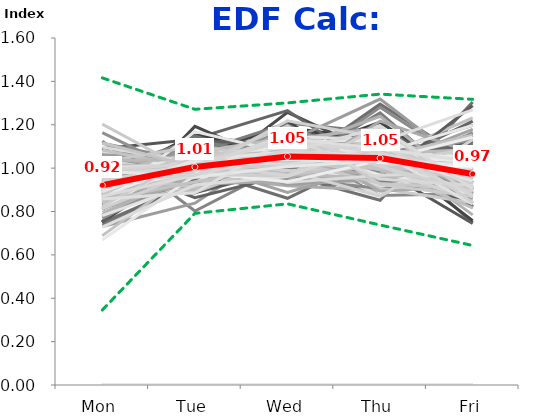
| Category | 1/1/01 | 1/8/01 | 1/15/01 | 1/22/01 | 1/29/01 | 2/5/01 | 2/12/01 | 2/19/01 | 2/26/01 | 3/5/01 | 3/12/01 | 3/19/01 | 3/26/01 | 4/2/01 | 4/9/01 | 4/16/01 | 4/23/01 | 4/30/01 | 5/7/01 | 5/14/01 | 5/21/01 | 5/28/01 | 6/4/01 | 6/11/01 | 6/18/01 | 6/25/01 | 7/2/01 | 7/9/01 | 7/16/01 | 7/23/01 | 7/30/01 | 8/6/01 | 8/13/01 | 8/20/01 | 8/27/01 | 9/3/01 | 9/10/01 | 9/17/01 | 9/24/01 | 10/1/01 | 10/8/01 | 10/15/01 | 10/22/01 | 10/29/01 | 11/5/01 | 11/12/01 | 11/19/01 | 11/26/01 | 12/3/01 | 12/10/01 | 12/17/01 | 12/24/01 | 12/31/01 | 1/7/02 | 1/14/02 | 1/21/02 | 1/28/02 | 2/4/02 | 2/11/02 | 2/18/02 | 2/25/02 | 3/4/02 | 3/11/02 | 3/18/02 | 3/25/02 | 4/1/02 | 4/8/02 | 4/15/02 | 4/22/02 | 4/29/02 | 5/6/02 | 5/13/02 | 5/20/02 | 5/27/02 | 6/3/02 | 6/10/02 | 6/17/02 | 6/24/02 | 7/1/02 | 7/8/02 | 7/15/02 | 7/22/02 | 7/29/02 | 8/5/02 | 8/12/02 | 8/19/02 | 8/26/02 | 9/2/02 | 9/9/02 | 9/16/02 | 9/23/02 | 9/30/02 | 10/7/02 | 10/14/02 | 10/21/02 | 10/28/02 | 11/4/02 | 11/11/02 | 11/18/02 | 11/25/02 | 12/2/02 | 12/9/02 | 12/16/02 | 12/23/02 | 12/30/02 | 1/6/03 | 1/13/03 | 1/20/03 | 1/27/03 | 2/3/03 | 2/10/03 | 2/17/03 | 2/24/03 | 3/3/03 | 3/10/03 | 3/17/03 | 3/24/03 | 3/31/03 | 4/7/03 | 4/14/03 | 4/21/03 | 4/28/03 | 5/5/03 | 5/12/03 | 5/19/03 | 5/26/03 | 6/2/03 | 6/9/03 | 6/16/03 | 6/23/03 | 6/30/03 | 7/7/03 | 7/14/03 | 7/21/03 | 7/28/03 | 8/4/03 | 8/11/03 | 8/18/03 | 8/25/03 | 9/1/03 | 9/8/03 | 9/15/03 | 9/22/03 | 9/29/03 | 10/6/03 | 10/13/03 | 10/20/03 | 10/27/03 | 11/3/03 | 11/10/03 | 11/17/03 | 11/24/03 | 12/1/03 | 12/8/03 | 12/15/03 | 12/22/03 | 12/29/03 | 1/5/04 | 1/12/04 | 1/19/04 | 1/26/04 | 2/2/04 | 2/9/04 | 2/16/04 | 2/23/04 | 3/1/04 | 3/8/04 | 3/15/04 | 3/22/04 | 3/29/04 | 4/5/04 | 4/12/04 | 4/19/04 | 4/26/04 | 5/3/04 | 5/10/04 | 5/17/04 | 5/24/04 | 5/31/04 | 6/7/04 | 6/14/04 | 6/21/04 | 6/28/04 | 7/5/04 | 7/12/04 | 7/19/04 | 7/26/04 | 8/2/04 | 8/9/04 | 8/16/04 | 8/23/04 | 8/30/04 | 9/6/04 | 9/13/04 | 9/20/04 | 9/27/04 | 10/4/04 | 10/11/04 | 10/18/04 | 10/25/04 | 11/1/04 | 11/8/04 | 11/15/04 | 11/22/04 | 11/29/04 | 12/6/04 | 12/13/04 | 12/20/04 | 12/27/04 | 1/3/05 | 1/10/05 | 1/17/05 | 1/24/05 | 1/31/05 | 2/7/05 | 2/14/05 | 2/21/05 | 2/28/05 | 3/7/05 | 3/14/05 | 3/21/05 | 3/28/05 | 4/4/05 | 4/11/05 | 4/18/05 | 4/25/05 | 5/2/05 | 5/9/05 | 5/16/05 | 5/23/05 | 5/30/05 | 6/6/05 | 6/13/05 | 6/20/05 | 6/27/05 | 7/4/05 | 7/11/05 | 7/18/05 | 7/25/05 | 8/1/05 | 8/8/05 | 8/15/05 | 8/22/05 | 8/29/05 | 9/5/05 | 9/12/05 | 9/19/05 | 9/26/05 | 10/3/05 | 10/10/05 | 10/17/05 | Min: | Max: | FINAL: |
|---|---|---|---|---|---|---|---|---|---|---|---|---|---|---|---|---|---|---|---|---|---|---|---|---|---|---|---|---|---|---|---|---|---|---|---|---|---|---|---|---|---|---|---|---|---|---|---|---|---|---|---|---|---|---|---|---|---|---|---|---|---|---|---|---|---|---|---|---|---|---|---|---|---|---|---|---|---|---|---|---|---|---|---|---|---|---|---|---|---|---|---|---|---|---|---|---|---|---|---|---|---|---|---|---|---|---|---|---|---|---|---|---|---|---|---|---|---|---|---|---|---|---|---|---|---|---|---|---|---|---|---|---|---|---|---|---|---|---|---|---|---|---|---|---|---|---|---|---|---|---|---|---|---|---|---|---|---|---|---|---|---|---|---|---|---|---|---|---|---|---|---|---|---|---|---|---|---|---|---|---|---|---|---|---|---|---|---|---|---|---|---|---|---|---|---|---|---|---|---|---|---|---|---|---|---|---|---|---|---|---|---|---|---|---|---|---|---|---|---|---|---|---|---|---|---|---|---|---|---|---|---|---|---|---|---|---|---|---|---|---|---|---|---|---|---|---|---|---|---|---|---|---|---|---|
| Mon | 0 | 0.882 | 0 | 0.96 | 0.928 | 0.934 | 0.915 | 0 | 0.933 | 0.866 | 0.901 | 0.827 | 0.888 | 0.924 | 0 | 0 | 0.873 | 1.055 | 0.94 | 0.737 | 1.089 | 0 | 0.88 | 0 | 0.871 | 0 | 0 | 0.842 | 0.85 | 0.864 | 0.81 | 0.82 | 0.858 | 0.884 | 0.864 | 0 | 0 | 1.125 | 1.064 | 0.847 | 0.749 | 0.824 | 0.868 | 0.893 | 0.949 | 0.754 | 0 | 0.849 | 0.857 | 0.882 | 0.857 | 0 | 0 | 1 | 0.941 | 0 | 0.748 | 0.939 | 0.946 | 0 | 0.984 | 1.051 | 0.909 | 0.931 | 0 | 0.894 | 0.836 | 0.877 | 0.859 | 0.933 | 0.885 | 0.844 | 0.912 | 0 | 0.877 | 0.83 | 0 | 0 | 0 | 0.731 | 0.964 | 0.953 | 1.005 | 0.965 | 0.779 | 1.007 | 0.893 | 0 | 0 | 0.689 | 0.871 | 1.047 | 0.852 | 0.751 | 0.952 | 0.934 | 1.091 | 0.817 | 0 | 0 | 1.115 | 1.016 | 0.875 | 0 | 0 | 0.948 | 0.987 | 0 | 0.955 | 0.913 | 0.926 | 0 | 0.913 | 0.929 | 0.816 | 1.053 | 1.014 | 1.049 | 1.164 | 0 | 0.753 | 0.852 | 0.989 | 0.958 | 0.974 | 0 | 1.028 | 0.95 | 0.885 | 1.001 | 0 | 0.979 | 0.927 | 0.896 | 0.905 | 0.993 | 0 | 0.887 | 0.897 | 0 | 0.965 | 0.832 | 0.885 | 0.924 | 0.815 | 0.796 | 0.77 | 0.879 | 0.975 | 0.961 | 1.031 | 0 | 0.974 | 0.898 | 0.979 | 0 | 0 | 0.929 | 0.933 | 0 | 0.857 | 1.024 | 0.903 | 0 | 0.968 | 1.07 | 0.814 | 1.074 | 0.996 | 0.937 | 0 | 0.781 | 0.785 | 0.781 | 1.062 | 1.203 | 1.051 | 0.892 | 0 | 0 | 0.901 | 0 | 0.989 | 0 | 0.844 | 0.887 | 0.958 | 0.921 | 0.866 | 0.959 | 0.975 | 0.841 | 0 | 1.038 | 0.913 | 0.847 | 1.083 | 0.668 | 0.876 | 0.861 | 0.865 | 0.934 | 0.97 | 0 | 0.855 | 0.902 | 0 | 0 | 1.027 | 0.958 | 1.012 | 0 | 0.931 | 1.035 | 0.913 | 0.869 | 0 | 1.097 | 0.952 | 0 | 0 | 0.815 | 1.116 | 0.728 | 0.987 | 0.849 | 0.981 | 0.906 | 0.993 | 1.002 | 0 | 0.876 | 0 | 0 | 1.001 | 0 | 0.993 | 0.825 | 0.899 | 0.901 | 0.953 | 0.892 | 0.972 | 0.814 | 0 | 0 | 0.907 | 0.987 | 0.87 | 0.94 | 0.858 | 0.346 | 1.416 | 0.921 |
| Tue | 0 | 0.971 | 0 | 1.016 | 1.016 | 0.976 | 0.947 | 0 | 0.919 | 1.022 | 0.998 | 0.908 | 1.059 | 1.021 | 0 | 0 | 1.031 | 0.984 | 0.996 | 0.921 | 1.133 | 0 | 1.152 | 0 | 0.928 | 0 | 0 | 1.018 | 1.012 | 1.051 | 1.063 | 1.01 | 0.978 | 1.022 | 1.009 | 0 | 0 | 0.802 | 0.995 | 0.905 | 0.933 | 0.969 | 1.037 | 1.048 | 1.018 | 1.028 | 0 | 0.973 | 0.931 | 0.991 | 0.913 | 0 | 0 | 0.964 | 1.012 | 0 | 1.135 | 1.155 | 0.921 | 0 | 0.953 | 1.017 | 1.005 | 0.991 | 0 | 1.009 | 0.943 | 1.051 | 1.016 | 1.156 | 1.07 | 1.095 | 1.11 | 0 | 0.995 | 0.955 | 0 | 0 | 0 | 0.838 | 0.91 | 1.026 | 1.044 | 1.026 | 0.978 | 1.023 | 1.149 | 0 | 0 | 0.996 | 1.073 | 1.002 | 1.046 | 1.193 | 1.009 | 1.032 | 0.886 | 0.993 | 0 | 0 | 1.03 | 0.989 | 0.887 | 0 | 0 | 1.05 | 0.972 | 0 | 0.969 | 1.053 | 0.979 | 0 | 1.102 | 0.972 | 0.934 | 0.963 | 1.042 | 1.024 | 0.955 | 0 | 1.124 | 1.013 | 1.131 | 0.989 | 1.076 | 0 | 0.864 | 0.928 | 0.971 | 1.024 | 0 | 1.072 | 1.034 | 1.026 | 1.023 | 1.02 | 0 | 1.013 | 1.128 | 0 | 1.026 | 1.014 | 0.926 | 1.075 | 1.042 | 0.961 | 0.973 | 1.116 | 1.002 | 0.898 | 1.016 | 0 | 1.019 | 1.074 | 0.996 | 0 | 0 | 0.899 | 0.982 | 0 | 0.965 | 0.968 | 0.97 | 0 | 1.062 | 1.067 | 0.956 | 1.011 | 1.001 | 0.889 | 0 | 0.997 | 0.991 | 0.934 | 1.04 | 0.972 | 0.993 | 1.12 | 0 | 0 | 1.021 | 0 | 1.032 | 0 | 0.904 | 0.968 | 1.079 | 0.983 | 0.997 | 1.022 | 1.073 | 1.168 | 0 | 0.972 | 0.999 | 0.925 | 0.999 | 0.967 | 1.082 | 1.061 | 0.987 | 1.016 | 0.913 | 0 | 0.986 | 1.015 | 0 | 0 | 1.102 | 1.063 | 1.012 | 0 | 1.013 | 1.039 | 0.961 | 1.038 | 0 | 1.025 | 0.981 | 0 | 0 | 1.061 | 1.005 | 0.922 | 0.994 | 0.938 | 1.035 | 0.979 | 1.017 | 1.018 | 0 | 1.089 | 0 | 0 | 0.969 | 0 | 1.019 | 1.056 | 1.031 | 1.028 | 0.987 | 1.037 | 1.003 | 0.987 | 0 | 0 | 1.019 | 0.957 | 0.968 | 0.968 | 0.887 | 0.791 | 1.271 | 1.006 |
| Wed | 0 | 1.025 | 0 | 1.079 | 1.143 | 1.071 | 1.014 | 0 | 1.011 | 1.055 | 1.025 | 0.982 | 1.027 | 1.114 | 0 | 0 | 1.022 | 1.118 | 1.119 | 1.208 | 1.037 | 0 | 1.095 | 0 | 1.058 | 0 | 0 | 1.115 | 1.076 | 1.122 | 1.195 | 1.113 | 1.088 | 1.09 | 0.985 | 0 | 0 | 1.021 | 0.948 | 1.187 | 0.998 | 1.168 | 1.047 | 1.092 | 1.071 | 1.092 | 0 | 1.062 | 1.257 | 1.052 | 1.008 | 0 | 0 | 1.114 | 1.072 | 0 | 1.265 | 1.081 | 0.992 | 0 | 1.013 | 1.011 | 1.057 | 1.031 | 0 | 1.046 | 1.104 | 1.078 | 1.006 | 1.03 | 1.207 | 1.103 | 1.058 | 0 | 0.861 | 1.215 | 0 | 0 | 0 | 1.121 | 0.969 | 1.181 | 1.148 | 1.013 | 1.157 | 1.059 | 1.016 | 0 | 0 | 1.033 | 1.064 | 0.967 | 0.992 | 1.006 | 1.05 | 0.959 | 1.095 | 1.055 | 0 | 0 | 1.099 | 0.998 | 0.996 | 0 | 0 | 0.974 | 1.005 | 0 | 1.051 | 1.062 | 0.94 | 0 | 1.018 | 1.035 | 1.061 | 0.919 | 1.03 | 1.114 | 1.008 | 0 | 1.115 | 1.176 | 1.041 | 0.968 | 1.032 | 0 | 0.97 | 1.089 | 0.979 | 1.053 | 0 | 1.108 | 1.088 | 0.971 | 0.948 | 1.124 | 0 | 0.96 | 0.983 | 0 | 1.138 | 0.974 | 1.102 | 1.066 | 1.003 | 1.15 | 1.078 | 1 | 0.986 | 1.034 | 1.003 | 0 | 1.022 | 1.066 | 0.933 | 0 | 0 | 1.022 | 0.953 | 0 | 1.081 | 1.048 | 1.199 | 0 | 0.941 | 0.953 | 1.083 | 1.024 | 1.048 | 1.042 | 0 | 1.081 | 1.131 | 1.144 | 0.925 | 1.079 | 1.143 | 1.008 | 0 | 0 | 0.888 | 0 | 1.102 | 0 | 1.1 | 1.124 | 1.039 | 0.986 | 1.103 | 1.028 | 1.14 | 1.067 | 0 | 0.99 | 1.102 | 0.94 | 1.013 | 1.1 | 1.062 | 1.092 | 1.048 | 1.031 | 1.119 | 0 | 1.091 | 1.034 | 0 | 0 | 1.039 | 1.095 | 1.079 | 0 | 1.023 | 0.971 | 1.039 | 1.009 | 0 | 0.933 | 1.086 | 0 | 0 | 1.014 | 0.972 | 0.962 | 1.014 | 1.01 | 1.129 | 0.937 | 1.195 | 1.074 | 0 | 1.018 | 0 | 0 | 0.966 | 0 | 0.966 | 1.069 | 1.018 | 1.041 | 1.16 | 1.075 | 1.155 | 1.218 | 0 | 0 | 1.126 | 1.008 | 1.068 | 1.084 | 1.136 | 0.835 | 1.301 | 1.054 |
| Thu | 0 | 1.115 | 0 | 1.038 | 0.987 | 1.024 | 1.017 | 0 | 1.069 | 1.046 | 0.924 | 1.281 | 0.985 | 1.008 | 0 | 0 | 1.141 | 0.947 | 1.047 | 1.165 | 0.997 | 0 | 1.124 | 0 | 1.212 | 0 | 0 | 1.123 | 1.104 | 1.066 | 1.094 | 1.104 | 1.081 | 0.969 | 1.183 | 0 | 0 | 0.952 | 0.904 | 1.129 | 1.296 | 1.011 | 1.071 | 1.063 | 1.139 | 1.1 | 0 | 1.034 | 1.058 | 1.096 | 1.005 | 0 | 0 | 0.994 | 1.007 | 0 | 0.983 | 0.935 | 1.031 | 0 | 1.001 | 0.995 | 0.908 | 1.058 | 0 | 1.101 | 1.147 | 1.066 | 1.112 | 0.968 | 0.911 | 0.972 | 1.102 | 0 | 1.069 | 0.951 | 0 | 0 | 0 | 1.319 | 0.852 | 1.083 | 0.942 | 1.118 | 1.133 | 1.074 | 1.117 | 0 | 0 | 1.049 | 1.041 | 0.95 | 1.118 | 1.15 | 1.107 | 1.096 | 0.972 | 1.096 | 0 | 0 | 0.874 | 0.972 | 0.954 | 0 | 0 | 1.039 | 1.076 | 0 | 0.994 | 1.047 | 1.112 | 0 | 0.955 | 1.004 | 1.153 | 0.897 | 0.957 | 0.944 | 0.991 | 0 | 1.102 | 0.929 | 0.938 | 1.042 | 1.055 | 0 | 1.015 | 1.118 | 1.005 | 1.001 | 0 | 1.004 | 1.071 | 1.118 | 1.176 | 1.044 | 0 | 1.122 | 1.08 | 0 | 0.971 | 1.083 | 1.068 | 0.874 | 1.254 | 1.071 | 1.047 | 1.045 | 1.023 | 1.068 | 0.995 | 0 | 1.088 | 1.065 | 1.024 | 0 | 0 | 1.145 | 1.057 | 0 | 1.131 | 1.014 | 1.015 | 0 | 0.962 | 0.906 | 1.239 | 0.917 | 1.048 | 1.042 | 0 | 1.101 | 1.187 | 1.133 | 0.949 | 0.906 | 0.893 | 1.058 | 0 | 0 | 1.011 | 0 | 1.094 | 0 | 1.067 | 1.127 | 1.028 | 1.017 | 1.109 | 1.019 | 0.995 | 1.057 | 0 | 0.87 | 1.021 | 1.217 | 1.01 | 1.069 | 1.069 | 1.018 | 1.069 | 0.959 | 0.994 | 0 | 1.098 | 1.076 | 0 | 0 | 0.929 | 0.969 | 0.991 | 0 | 0.999 | 0.954 | 1.034 | 1.053 | 0 | 0.968 | 1.054 | 0 | 0 | 1.052 | 1.007 | 1.12 | 1.053 | 1.05 | 1.012 | 1.036 | 0.925 | 1.071 | 0 | 1.077 | 0 | 0 | 1.194 | 0 | 1.103 | 1.12 | 1.067 | 1.027 | 1.008 | 1.055 | 0.95 | 1.14 | 0 | 0 | 1.072 | 1.034 | 1.19 | 1.041 | 1.089 | 0.738 | 1.341 | 1.046 |
| Fri | 0 | 1.008 | 0 | 0.907 | 0.925 | 0.994 | 1.108 | 0 | 1.068 | 1.012 | 1.152 | 1.003 | 1.041 | 0.933 | 0 | 0 | 0.933 | 0.897 | 0.898 | 0.969 | 0.745 | 0 | 0.749 | 0 | 0.932 | 0 | 0 | 0.903 | 0.957 | 0.897 | 0.838 | 0.953 | 0.995 | 1.035 | 0.959 | 0 | 0 | 1.1 | 1.089 | 0.932 | 1.024 | 1.028 | 0.977 | 0.904 | 0.823 | 1.026 | 0 | 1.082 | 0.897 | 0.979 | 1.217 | 0 | 0 | 0.929 | 0.968 | 0 | 0.869 | 0.89 | 1.109 | 0 | 1.048 | 0.926 | 1.122 | 0.989 | 0 | 0.951 | 0.97 | 0.928 | 1.007 | 0.913 | 0.927 | 0.986 | 0.817 | 0 | 1.198 | 1.049 | 0 | 0 | 0 | 0.992 | 1.305 | 0.758 | 0.861 | 0.879 | 0.952 | 0.838 | 0.825 | 0 | 0 | 1.232 | 0.95 | 1.033 | 0.992 | 0.9 | 0.882 | 0.978 | 0.956 | 1.039 | 0 | 0 | 0.883 | 1.024 | 1.288 | 0 | 0 | 0.989 | 0.96 | 0 | 1.031 | 0.926 | 1.042 | 0 | 1.012 | 1.061 | 1.036 | 1.167 | 0.958 | 0.869 | 0.882 | 0 | 0.905 | 1.03 | 0.901 | 1.042 | 0.863 | 0 | 1.123 | 0.916 | 1.16 | 0.921 | 0 | 0.836 | 0.881 | 0.989 | 0.948 | 0.819 | 0 | 1.018 | 0.912 | 0 | 0.9 | 1.097 | 1.019 | 1.062 | 0.885 | 1.022 | 1.132 | 0.96 | 1.014 | 1.039 | 0.955 | 0 | 0.897 | 0.897 | 1.067 | 0 | 0 | 1.005 | 1.075 | 0 | 0.967 | 0.947 | 0.914 | 0 | 1.067 | 1.004 | 0.907 | 0.973 | 0.907 | 1.09 | 0 | 1.04 | 0.906 | 1.008 | 1.025 | 0.84 | 0.919 | 0.923 | 0 | 0 | 1.179 | 0 | 0.784 | 0 | 1.085 | 0.895 | 0.896 | 1.093 | 0.926 | 0.973 | 0.817 | 0.867 | 0 | 1.131 | 0.965 | 1.071 | 0.895 | 1.197 | 0.911 | 0.968 | 1.031 | 1.059 | 1.005 | 0 | 0.97 | 0.972 | 0 | 0 | 0.903 | 0.916 | 0.905 | 0 | 1.034 | 1.002 | 1.053 | 1.031 | 0 | 0.977 | 0.928 | 0 | 0 | 1.059 | 0.9 | 1.269 | 0.952 | 1.153 | 0.843 | 1.142 | 0.87 | 0.835 | 0 | 0.94 | 0 | 0 | 0.869 | 0 | 0.92 | 0.929 | 0.985 | 1.003 | 0.891 | 0.941 | 0.92 | 0.841 | 0 | 0 | 0.876 | 1.014 | 0.904 | 0.967 | 1.03 | 0.643 | 1.317 | 0.973 |